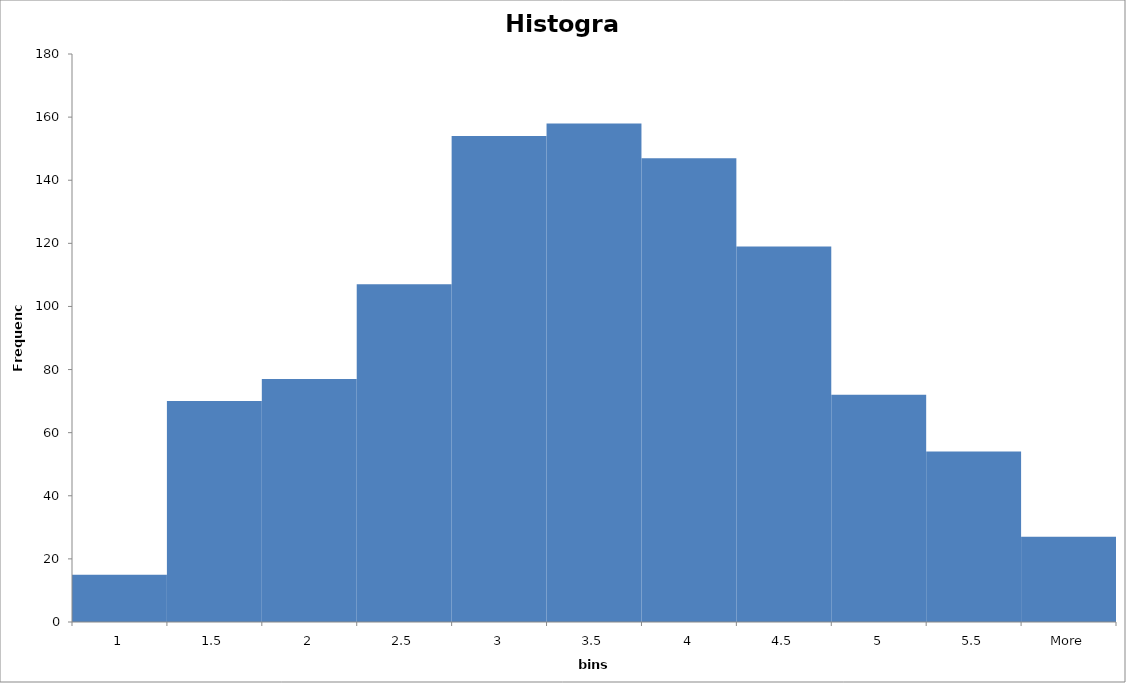
| Category | Frequency |
|---|---|
| 1 | 15 |
| 1.5 | 70 |
| 2 | 77 |
| 2.5 | 107 |
| 3 | 154 |
| 3.5 | 158 |
| 4 | 147 |
| 4.5 | 119 |
| 5 | 72 |
| 5.5 | 54 |
| More | 27 |